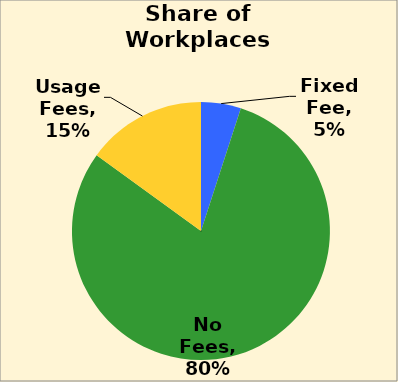
| Category | Series 0 |
|---|---|
| Fixed Fee | 0.05 |
| No Fees | 0.8 |
| Usage Fees | 0.15 |